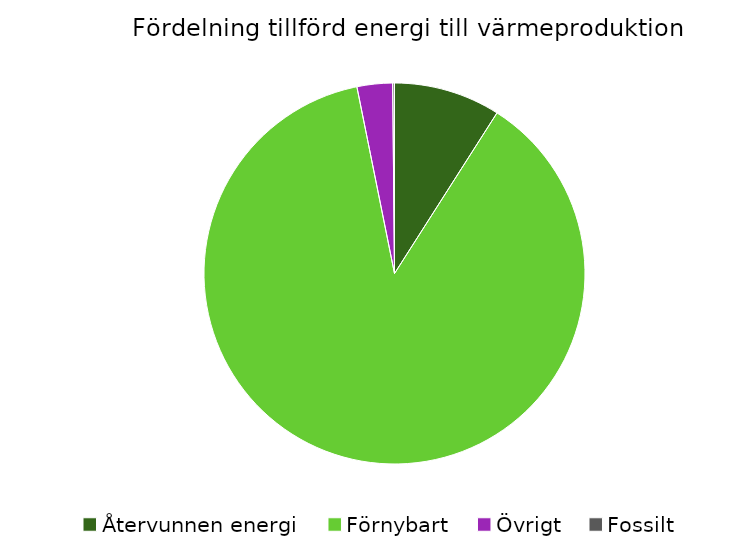
| Category | Fördelning värmeproduktion |
|---|---|
| Återvunnen energi | 0.09 |
| Förnybart | 0.878 |
| Övrigt | 0.03 |
| Fossilt | 0.002 |